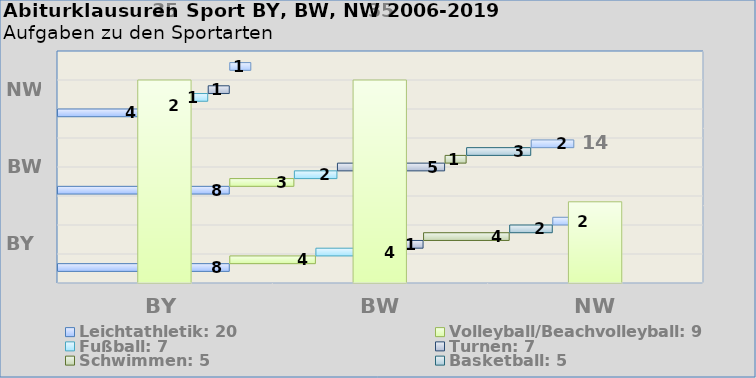
| Category | Alle Sportarten |
|---|---|
| BY | 35 |
| BW | 35 |
| NW | 14 |